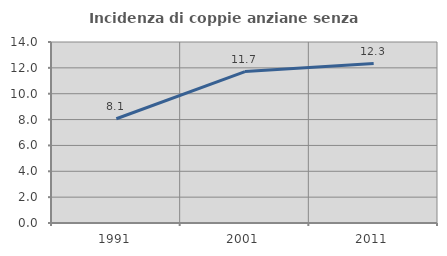
| Category | Incidenza di coppie anziane senza figli  |
|---|---|
| 1991.0 | 8.065 |
| 2001.0 | 11.71 |
| 2011.0 | 12.329 |